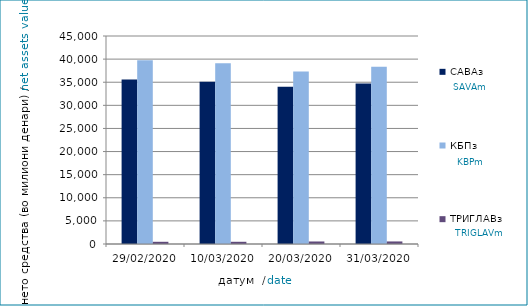
| Category | САВАз | КБПз | ТРИГЛАВз |
|---|---|---|---|
| 29/02/2020 | 35562.972 | 39740.775 | 477.93 |
| 10/03/2020 | 35112.034 | 39081.92 | 480.108 |
| 20/03/2020 | 34000.504 | 37299.02 | 544.321 |
| 31/03/2020 | 34704.799 | 38342.004 | 552.974 |